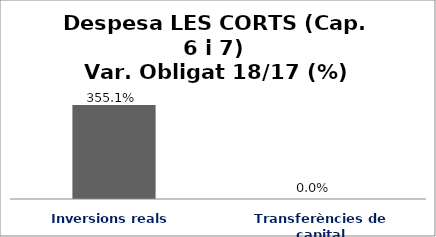
| Category | Series 0 |
|---|---|
| Inversions reals | 3.551 |
| Transferències de capital | 0 |